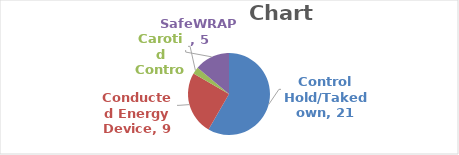
| Category | Series 0 |
|---|---|
| Control Hold/Takedown | 21 |
| Conducted Energy Device | 9 |
| Carotid Control Hold | 1 |
| SafeWRAP | 5 |